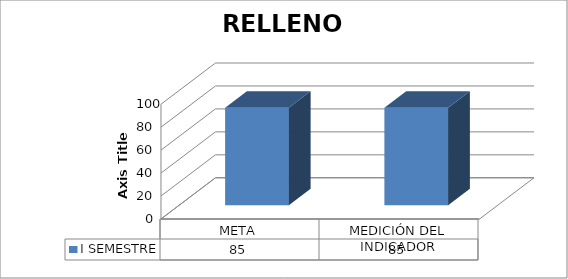
| Category | I SEMESTRE |
|---|---|
| META | 85 |
| MEDICIÓN DEL INDICADOR | 85 |